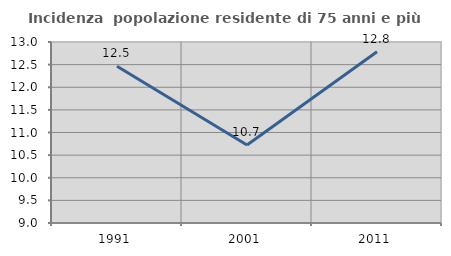
| Category | Incidenza  popolazione residente di 75 anni e più |
|---|---|
| 1991.0 | 12.466 |
| 2001.0 | 10.723 |
| 2011.0 | 12.784 |